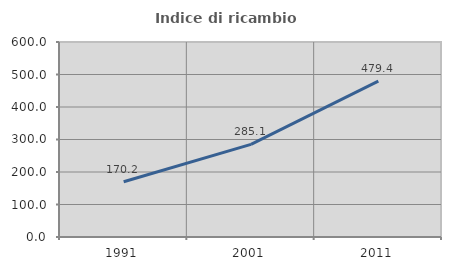
| Category | Indice di ricambio occupazionale  |
|---|---|
| 1991.0 | 170.175 |
| 2001.0 | 285.106 |
| 2011.0 | 479.412 |